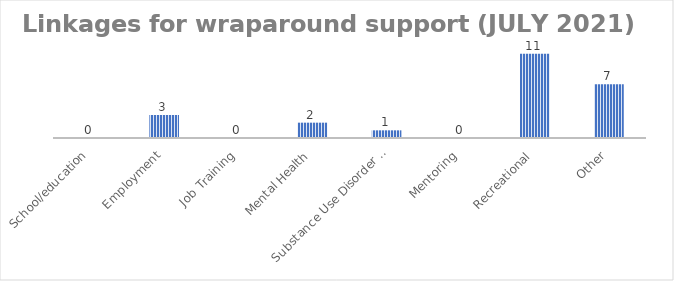
| Category | Series 0 |
|---|---|
| School/education | 0 |
| Employment | 3 |
| Job Training | 0 |
| Mental Health | 2 |
| Substance Use Disorder Treatment | 1 |
| Mentoring | 0 |
| Recreational | 11 |
| Other | 7 |